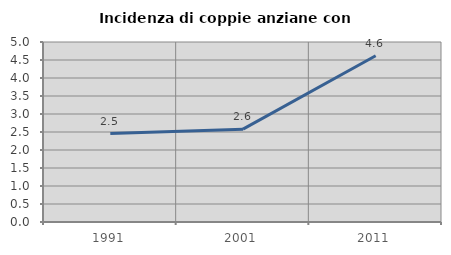
| Category | Incidenza di coppie anziane con figli |
|---|---|
| 1991.0 | 2.457 |
| 2001.0 | 2.578 |
| 2011.0 | 4.618 |